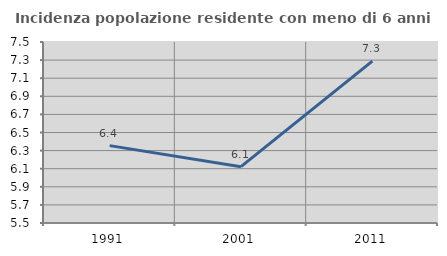
| Category | Incidenza popolazione residente con meno di 6 anni |
|---|---|
| 1991.0 | 6.355 |
| 2001.0 | 6.122 |
| 2011.0 | 7.289 |